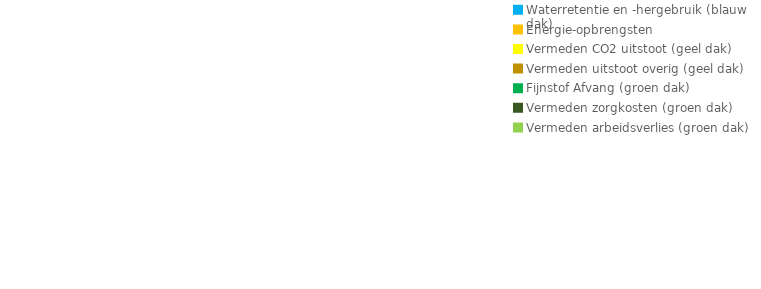
| Category | Series 0 |
|---|---|
| Waterretentie en -hergebruik (blauw dak) | 0 |
| Energie-opbrengsten | 0 |
| Vermeden CO2 uitstoot (geel dak) | 0 |
| Vermeden uitstoot overig (geel dak) | 0 |
| Fijnstof Afvang (groen dak) | 0 |
| Vermeden zorgkosten (groen dak) | 0 |
| Vermeden arbeidsverlies (groen dak) | 0 |
| Vastgoedwaarde | 0 |